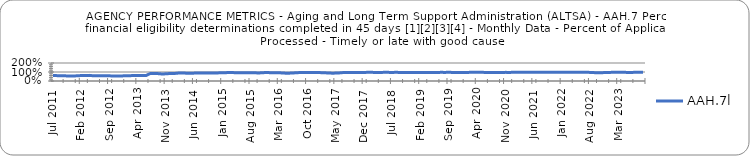
| Category | AAH.7l |
|---|---|
| 2011-07-01 | 0.608 |
| 2011-08-01 | 0.596 |
| 2011-09-01 | 0.581 |
| 2011-10-01 | 0.574 |
| 2011-11-01 | 0.549 |
| 2011-12-01 | 0.549 |
| 2012-01-01 | 0.581 |
| 2012-02-01 | 0.605 |
| 2012-03-01 | 0.607 |
| 2012-04-01 | 0.625 |
| 2012-05-01 | 0.578 |
| 2012-06-01 | 0.58 |
| 2012-07-01 | 0.589 |
| 2012-08-01 | 0.586 |
| 2012-09-01 | 0.573 |
| 2012-10-01 | 0.556 |
| 2012-11-01 | 0.562 |
| 2012-12-01 | 0.562 |
| 2013-01-01 | 0.589 |
| 2013-02-01 | 0.582 |
| 2013-03-01 | 0.624 |
| 2013-04-01 | 0.623 |
| 2013-05-01 | 0.609 |
| 2013-06-01 | 0.598 |
| 2013-07-01 | 0.819 |
| 2013-08-01 | 0.834 |
| 2013-09-01 | 0.82 |
| 2013-10-01 | 0.779 |
| 2013-11-01 | 0.799 |
| 2013-12-01 | 0.836 |
| 2014-01-01 | 0.833 |
| 2014-02-01 | 0.879 |
| 2014-03-01 | 0.896 |
| 2014-04-01 | 0.868 |
| 2014-05-01 | 0.858 |
| 2014-06-01 | 0.876 |
| 2014-07-01 | 0.887 |
| 2014-08-01 | 0.899 |
| 2014-09-01 | 0.9 |
| 2014-10-01 | 0.901 |
| 2014-11-01 | 0.886 |
| 2014-12-01 | 0.903 |
| 2015-01-01 | 0.913 |
| 2015-02-01 | 0.931 |
| 2015-03-01 | 0.946 |
| 2015-04-01 | 0.925 |
| 2015-05-01 | 0.913 |
| 2015-06-01 | 0.917 |
| 2015-07-01 | 0.911 |
| 2015-08-01 | 0.911 |
| 2015-09-01 | 0.906 |
| 2015-10-01 | 0.896 |
| 2015-11-01 | 0.923 |
| 2015-12-01 | 0.952 |
| 2016-01-01 | 0.908 |
| 2016-02-01 | 0.914 |
| 2016-03-01 | 0.914 |
| 2016-04-01 | 0.885 |
| 2016-05-01 | 0.859 |
| 2016-06-01 | 0.884 |
| 2016-07-01 | 0.91 |
| 2016-08-01 | 0.937 |
| 2016-09-01 | 0.949 |
| 2016-10-01 | 0.951 |
| 2016-11-01 | 0.947 |
| 2016-12-01 | 0.946 |
| 2017-01-01 | 0.933 |
| 2017-02-01 | 0.919 |
| 2017-03-01 | 0.893 |
| 2017-04-01 | 0.871 |
| 2017-05-01 | 0.876 |
| 2017-06-01 | 0.904 |
| 2017-07-01 | 0.945 |
| 2017-08-01 | 0.949 |
| 2017-09-01 | 0.951 |
| 2017-10-01 | 0.943 |
| 2017-11-01 | 0.939 |
| 2017-12-01 | 0.952 |
| 2018-01-01 | 0.964 |
| 2018-02-01 | 0.959 |
| 2018-03-01 | 0.955 |
| 2018-04-01 | 0.953 |
| 2018-05-01 | 0.961 |
| 2018-06-01 | 0.959 |
| 2018-07-01 | 0.954 |
| 2018-08-01 | 0.964 |
| 2018-09-01 | 0.948 |
| 2018-10-01 | 0.956 |
| 2018-11-01 | 0.95 |
| 2018-12-01 | 0.94 |
| 2019-01-01 | 0.952 |
| 2019-02-01 | 0.947 |
| 2019-03-01 | 0.949 |
| 2019-04-01 | 0.945 |
| 2019-05-01 | 0.951 |
| 2019-06-01 | 0.95 |
| 2019-07-01 | 0.96 |
| 2019-08-01 | 0.956 |
| 2019-09-01 | 0.965 |
| 2019-10-01 | 0.951 |
| 2019-11-01 | 0.935 |
| 2019-12-01 | 0.943 |
| 2020-01-01 | 0.941 |
| 2020-02-01 | 0.959 |
| 2020-03-01 | 0.974 |
| 2020-04-01 | 0.964 |
| 2020-05-01 | 0.964 |
| 2020-06-01 | 0.954 |
| 2020-07-01 | 0.949 |
| 2020-08-01 | 0.951 |
| 2020-09-01 | 0.952 |
| 2020-10-01 | 0.941 |
| 2020-11-01 | 0.959 |
| 2020-12-01 | 0.953 |
| 2021-01-01 | 0.969 |
| 2021-02-01 | 0.97 |
| 2021-03-01 | 0.972 |
| 2021-04-01 | 0.965 |
| 2021-05-01 | 0.968 |
| 2021-06-01 | 0.968 |
| 2021-07-01 | 0.977 |
| 2021-08-01 | 0.972 |
| 2021-09-01 | 0.969 |
| 2021-10-01 | 0.97 |
| 2021-11-01 | 0.964 |
| 2021-12-01 | 0.974 |
| 2022-01-01 | 0.974 |
| 2022-02-01 | 0.97 |
| 2022-03-01 | 0.981 |
| 2022-04-01 | 0.979 |
| 2022-05-01 | 0.976 |
| 2022-06-01 | 0.977 |
| 2022-07-01 | 0.966 |
| 2022-08-01 | 0.955 |
| 2022-09-01 | 0.929 |
| 2022-10-01 | 0.925 |
| 2022-11-01 | 0.928 |
| 2022-12-01 | 0.943 |
| 2023-01-01 | 0.958 |
| 2023-02-01 | 0.968 |
| 2023-03-01 | 0.967 |
| 2023-04-01 | 0.966 |
| 2023-05-01 | 0.956 |
| 2023-06-01 | 0.952 |
| 2023-07-01 | 0.963 |
| 2023-08-01 | 0.963 |
| 2023-09-01 | 0.981 |